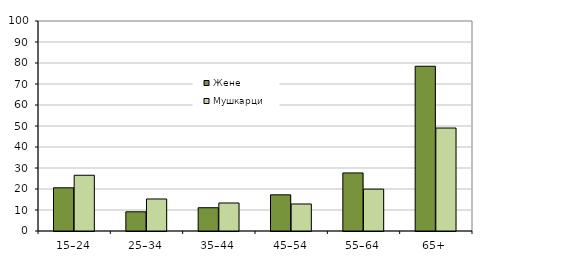
| Category | Жене | Мушкарци |
|---|---|---|
| 15–24 | 20.575 | 26.546 |
| 25–34 | 9.144 | 15.247 |
| 35–44 | 11.079 | 13.336 |
| 45–54 | 17.222 | 12.866 |
| 55–64 | 27.652 | 19.95 |
| 65+ | 78.45 | 49.04 |